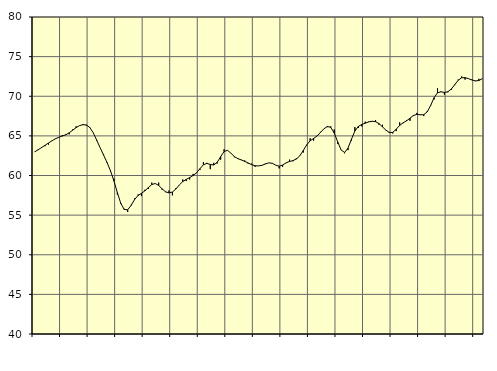
| Category | Piggar | Samtliga anställda (inkl. anställda utomlands) |
|---|---|---|
| nan | 63 | 62.98 |
| 87.0 | 63.2 | 63.26 |
| 87.0 | 63.6 | 63.53 |
| 87.0 | 63.7 | 63.81 |
| nan | 63.9 | 64.1 |
| 88.0 | 64.4 | 64.38 |
| 88.0 | 64.6 | 64.63 |
| 88.0 | 64.8 | 64.82 |
| nan | 65.1 | 64.98 |
| 89.0 | 65.2 | 65.13 |
| 89.0 | 65.2 | 65.38 |
| 89.0 | 65.8 | 65.7 |
| nan | 66.2 | 66.04 |
| 90.0 | 66.3 | 66.29 |
| 90.0 | 66.5 | 66.41 |
| 90.0 | 66.3 | 66.38 |
| nan | 66.1 | 66.06 |
| 91.0 | 65.4 | 65.39 |
| 91.0 | 64.4 | 64.46 |
| 91.0 | 63.5 | 63.5 |
| nan | 62.7 | 62.58 |
| 92.0 | 61.7 | 61.64 |
| 92.0 | 60.5 | 60.61 |
| 92.0 | 59.6 | 59.32 |
| nan | 57.6 | 57.84 |
| 93.0 | 56.4 | 56.49 |
| 93.0 | 55.8 | 55.71 |
| 93.0 | 55.4 | 55.68 |
| nan | 56.3 | 56.23 |
| 94.0 | 57.1 | 56.96 |
| 94.0 | 57.6 | 57.48 |
| 94.0 | 57.4 | 57.75 |
| nan | 58.2 | 58.06 |
| 95.0 | 58.3 | 58.47 |
| 95.0 | 59.1 | 58.86 |
| 95.0 | 59 | 58.99 |
| nan | 59.1 | 58.75 |
| 96.0 | 58.2 | 58.32 |
| 96.0 | 57.9 | 57.95 |
| 96.0 | 58.1 | 57.8 |
| nan | 57.5 | 57.92 |
| 97.0 | 58.4 | 58.29 |
| 97.0 | 58.8 | 58.81 |
| 97.0 | 59.5 | 59.23 |
| nan | 59.3 | 59.5 |
| 98.0 | 59.5 | 59.74 |
| 98.0 | 60.2 | 60 |
| 98.0 | 60.3 | 60.34 |
| nan | 60.7 | 60.86 |
| 99.0 | 61.7 | 61.36 |
| 99.0 | 61.6 | 61.52 |
| 99.0 | 60.8 | 61.4 |
| nan | 61.6 | 61.32 |
| 0.0 | 61.5 | 61.66 |
| 0.0 | 62 | 62.37 |
| 0.0 | 63.3 | 63.02 |
| nan | 63.2 | 63.18 |
| 1.0 | 62.8 | 62.81 |
| 1.0 | 62.3 | 62.38 |
| 1.0 | 62.2 | 62.13 |
| nan | 62 | 61.96 |
| 2.0 | 61.9 | 61.78 |
| 2.0 | 61.5 | 61.58 |
| 2.0 | 61.5 | 61.37 |
| nan | 61.1 | 61.23 |
| 3.0 | 61.2 | 61.21 |
| 3.0 | 61.3 | 61.28 |
| 3.0 | 61.5 | 61.45 |
| nan | 61.6 | 61.6 |
| 4.0 | 61.5 | 61.54 |
| 4.0 | 61.3 | 61.31 |
| 4.0 | 60.9 | 61.17 |
| nan | 61.1 | 61.32 |
| 5.0 | 61.6 | 61.59 |
| 5.0 | 62 | 61.77 |
| 5.0 | 61.8 | 61.88 |
| nan | 62.2 | 62.08 |
| 6.0 | 62.5 | 62.48 |
| 6.0 | 62.9 | 63.15 |
| 6.0 | 63.8 | 63.87 |
| nan | 64.7 | 64.38 |
| 7.0 | 64.4 | 64.67 |
| 7.0 | 65 | 64.98 |
| 7.0 | 65.5 | 65.44 |
| nan | 65.9 | 65.89 |
| 8.0 | 66.1 | 66.19 |
| 8.0 | 66.2 | 66.07 |
| 8.0 | 65.8 | 65.36 |
| nan | 64 | 64.25 |
| 9.0 | 63.2 | 63.22 |
| 9.0 | 62.8 | 62.91 |
| 9.0 | 63.2 | 63.46 |
| nan | 64.4 | 64.58 |
| 10.0 | 66.1 | 65.61 |
| 10.0 | 66 | 66.19 |
| 10.0 | 66.2 | 66.45 |
| nan | 66.8 | 66.6 |
| 11.0 | 66.8 | 66.76 |
| 11.0 | 66.8 | 66.85 |
| 11.0 | 67 | 66.79 |
| nan | 66.4 | 66.55 |
| 12.0 | 66.4 | 66.14 |
| 12.0 | 65.7 | 65.73 |
| 12.0 | 65.5 | 65.42 |
| nan | 65.3 | 65.44 |
| 13.0 | 65.6 | 65.84 |
| 13.0 | 66.7 | 66.32 |
| 13.0 | 66.6 | 66.65 |
| nan | 67 | 66.9 |
| 14.0 | 66.9 | 67.23 |
| 14.0 | 67.5 | 67.57 |
| 14.0 | 67.9 | 67.71 |
| nan | 67.7 | 67.66 |
| 15.0 | 67.5 | 67.67 |
| 15.0 | 68.1 | 68.03 |
| 15.0 | 68.9 | 68.83 |
| nan | 69.6 | 69.82 |
| 16.0 | 71 | 70.44 |
| 16.0 | 70.6 | 70.56 |
| 16.0 | 70.2 | 70.48 |
| nan | 70.5 | 70.57 |
| 17.0 | 70.8 | 70.91 |
| 17.0 | 71.4 | 71.46 |
| 17.0 | 72.1 | 72.02 |
| nan | 72.5 | 72.33 |
| 18.0 | 72.1 | 72.35 |
| 18.0 | 72.2 | 72.22 |
| 18.0 | 72.1 | 72.05 |
| nan | 71.9 | 71.94 |
| 19.0 | 72.2 | 71.98 |
| 19.0 | 72.2 | 72.22 |